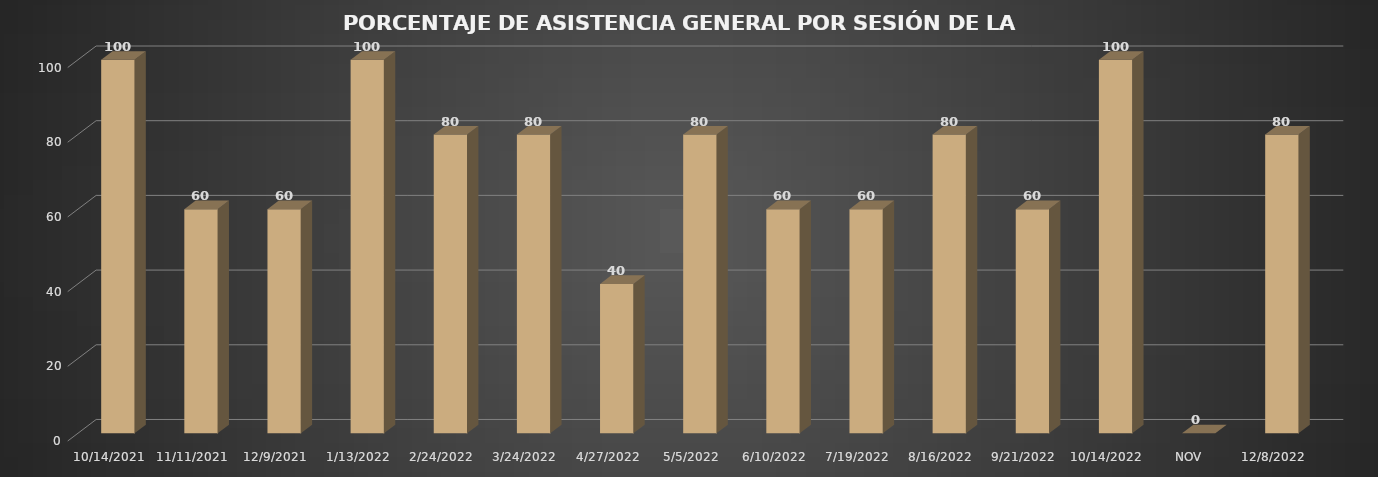
| Category | Series 0 |
|---|---|
| 14/10/2021 | 100 |
| 11/11/2021 | 60 |
| 09/12/2021 | 60 |
| 13/01/2022 | 100 |
| 24/02/2022 | 80 |
| 24/03/2022 | 80 |
| 27/04/2022 | 40 |
| 05/05/2022 | 80 |
| 10/06/2022 | 60 |
| 19/07/2022 | 60 |
| 16/08/2022 | 80 |
| 21/09/2022 | 60 |
| 14/10/2022 | 100 |
| NOV | 0 |
| 08/12/2022 | 80 |